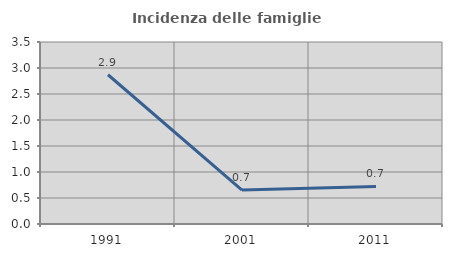
| Category | Incidenza delle famiglie numerose |
|---|---|
| 1991.0 | 2.87 |
| 2001.0 | 0.653 |
| 2011.0 | 0.722 |